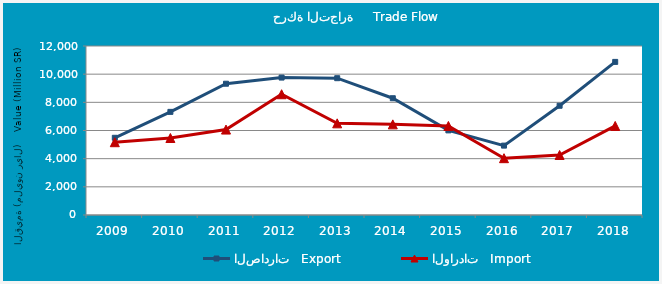
| Category | الصادرات   Export | الواردات   Import |
|---|---|---|
| 2009.0 | 5482261242 | 5168535871 |
| 2010.0 | 7322580075 | 5467010640 |
| 2011.0 | 9321640473 | 6066481770 |
| 2012.0 | 9757979053 | 8574247141 |
| 2013.0 | 9713390199 | 6509101253 |
| 2014.0 | 8291134252 | 6435063791 |
| 2015.0 | 6008246399 | 6322069553 |
| 2016.0 | 4926306038 | 4034831813 |
| 2017.0 | 7756655728 | 4260943789 |
| 2018.0 | 10870634742 | 6322928810 |